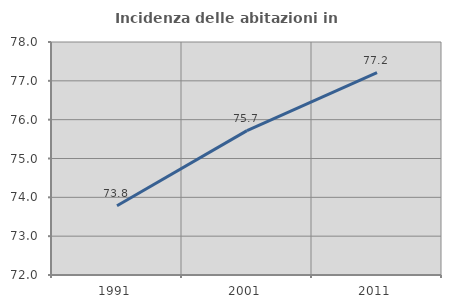
| Category | Incidenza delle abitazioni in proprietà  |
|---|---|
| 1991.0 | 73.782 |
| 2001.0 | 75.717 |
| 2011.0 | 77.212 |